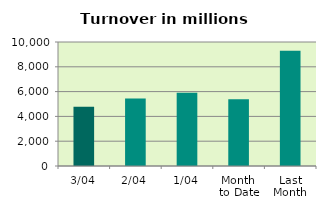
| Category | Series 0 |
|---|---|
| 3/04 | 4781.348 |
| 2/04 | 5452.424 |
| 1/04 | 5915.004 |
| Month 
to Date | 5382.926 |
| Last
Month | 9287.764 |